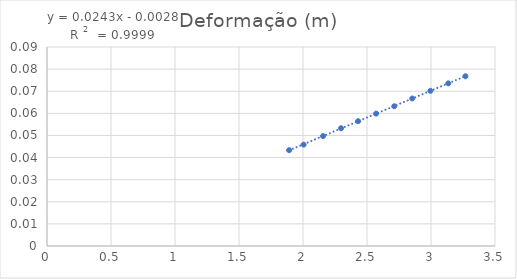
| Category | Deformação (m) |
|---|---|
| 1.8915642 | 0.043 |
| 2.0048697 | 0.046 |
| 2.1568266 | 0.05 |
| 2.2974039000000004 | 0.053 |
| 2.4304275 | 0.056 |
| 2.5713972000000003 | 0.06 |
| 2.7126612 | 0.063 |
| 2.8534347 | 0.067 |
| 2.9952873 | 0.07 |
| 3.1351779 | 0.074 |
| 3.2690844 | 0.077 |